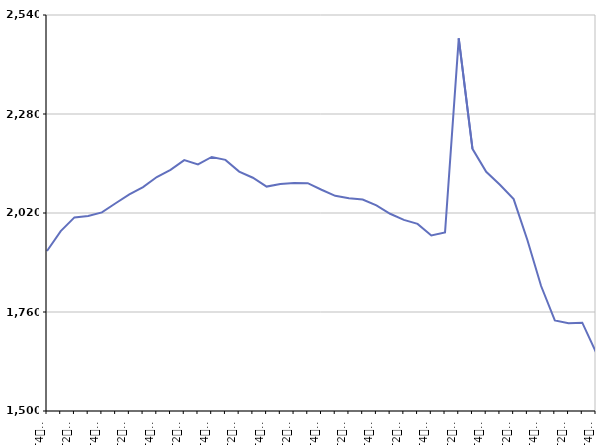
| Category | De 25 à 49 ans |
|---|---|
| T4
2012 | 1920.2 |
| T1
2013 | 1972.4 |
| T2
2013 | 2008.4 |
| T3
2013 | 2012.4 |
| T4
2013 | 2021.5 |
| T1
2014 | 2045.5 |
| T2
2014 | 2068.9 |
| T3
2014 | 2087.9 |
| T4
2014 | 2114.5 |
| T1
2015 | 2133.4 |
| T2
2015 | 2158.8 |
| T3
2015 | 2147.8 |
| T4
2015 | 2167.1 |
| T1
2016 | 2159.5 |
| T2
2016 | 2128.7 |
| T3
2016 | 2112.6 |
| T4
2016 | 2089.4 |
| T1
2017 | 2096.3 |
| T2
2017 | 2098.5 |
| T3
2017 | 2098.4 |
| T4
2017 | 2081.1 |
| T1
2018 | 2065.1 |
| T2
2018 | 2058.7 |
| T3
2018 | 2055.4 |
| T4
2018 | 2040.1 |
| T1
2019 | 2018 |
| T2
2019 | 2001.8 |
| T3
2019 | 1991.4 |
| T4
2019 | 1960.9 |
| T1
2020 | 1968.8 |
| T2
2020 | 2478.6 |
| T3
2020 | 2188.6 |
| T4
2020 | 2128.1 |
| T1
2021 | 2094.3 |
| T2
2021 | 2056.5 |
| T3
2021 | 1949.1 |
| T4
2021 | 1828.2 |
| T1
2022 | 1738 |
| T2
2022 | 1730.4 |
| T3
2022 | 1732 |
| T4
2022 | 1654.2 |